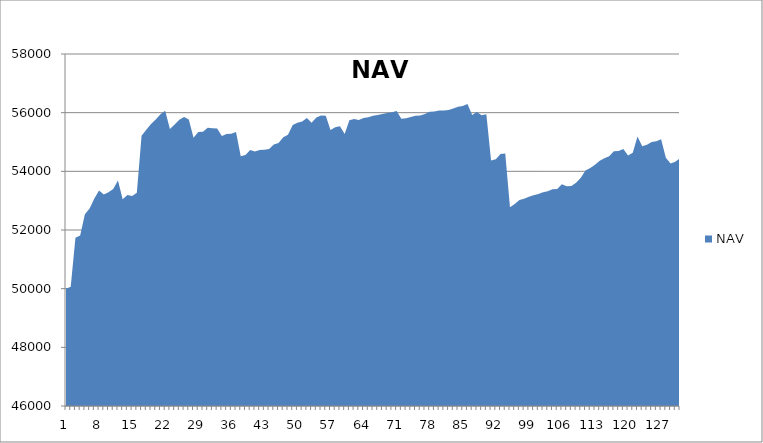
| Category | NAV |
|---|---|
| 0 | 50000 |
| 1 | 50069.444 |
| 2 | 51736.444 |
| 3 | 51809.343 |
| 4 | 52539.343 |
| 5 | 52733.57 |
| 6 | 53070.527 |
| 7 | 53346.212 |
| 8 | 53210.13 |
| 9 | 53285.788 |
| 10 | 53396.685 |
| 11 | 53684.185 |
| 12 | 53050.597 |
| 13 | 53191.058 |
| 14 | 53162.649 |
| 15 | 53270.317 |
| 16 | 55214.762 |
| 17 | 55418.583 |
| 18 | 55617.273 |
| 19 | 55770.477 |
| 20 | 55945.477 |
| 21 | 56069.601 |
| 22 | 55444.601 |
| 23 | 55597.925 |
| 24 | 55757.558 |
| 25 | 55851.308 |
| 26 | 55764.06 |
| 27 | 55148.361 |
| 28 | 55340.028 |
| 29 | 55349.317 |
| 30 | 55485.393 |
| 31 | 55468.704 |
| 32 | 55461.038 |
| 33 | 55205.356 |
| 34 | 55270.356 |
| 35 | 55282.57 |
| 36 | 55341.011 |
| 37 | 54517.482 |
| 38 | 54554.291 |
| 39 | 54731.016 |
| 40 | 54679.093 |
| 41 | 54730.595 |
| 42 | 54736.73 |
| 43 | 54765.085 |
| 44 | 54915.643 |
| 45 | 54969.86 |
| 46 | 55164.665 |
| 47 | 55247.746 |
| 48 | 55575.668 |
| 49 | 55657.905 |
| 50 | 55701.032 |
| 51 | 55819.28 |
| 52 | 55652.834 |
| 53 | 55838.604 |
| 54 | 55905.769 |
| 55 | 55898.888 |
| 56 | 55410.9 |
| 57 | 55504.564 |
| 58 | 55537.603 |
| 59 | 55268.471 |
| 60 | 55737.858 |
| 61 | 55785.708 |
| 62 | 55749.829 |
| 63 | 55815.591 |
| 64 | 55842.34 |
| 65 | 55894.021 |
| 66 | 55916.828 |
| 67 | 55955.697 |
| 68 | 55991.896 |
| 69 | 56012.065 |
| 70 | 56060.293 |
| 71 | 55791.443 |
| 72 | 55810.674 |
| 73 | 55852.843 |
| 74 | 55892.018 |
| 75 | 55900.069 |
| 76 | 55955.739 |
| 77 | 56030.918 |
| 78 | 56036.168 |
| 79 | 56069.975 |
| 80 | 56071.656 |
| 81 | 56090.406 |
| 82 | 56141.798 |
| 83 | 56199.159 |
| 84 | 56228.237 |
| 85 | 56292.573 |
| 86 | 55924.369 |
| 87 | 56019.106 |
| 88 | 55916.165 |
| 89 | 55950.09 |
| 90 | 54367.13 |
| 91 | 54411.811 |
| 92 | 54588.933 |
| 93 | 54611.197 |
| 94 | 52777.117 |
| 95 | 52883.107 |
| 96 | 53025.651 |
| 97 | 53064.908 |
| 98 | 53135.652 |
| 99 | 53186.005 |
| 100 | 53229.789 |
| 101 | 53290.192 |
| 102 | 53319.038 |
| 103 | 53392.112 |
| 104 | 53401.462 |
| 105 | 53559.878 |
| 106 | 53489.526 |
| 107 | 53501.684 |
| 108 | 53607.597 |
| 109 | 53785.178 |
| 110 | 54030.211 |
| 111 | 54113.452 |
| 112 | 54226.272 |
| 113 | 54358.625 |
| 114 | 54444.736 |
| 115 | 54518.421 |
| 116 | 54681.882 |
| 117 | 54693.454 |
| 118 | 54759.719 |
| 119 | 54542.637 |
| 120 | 54631.804 |
| 121 | 55189.582 |
| 122 | 54857.283 |
| 123 | 54902.45 |
| 124 | 54998.878 |
| 125 | 55024.352 |
| 126 | 55097.595 |
| 127 | 54460.788 |
| 128 | 54265.386 |
| 129 | 54330.201 |
| 130 | 54444.032 |